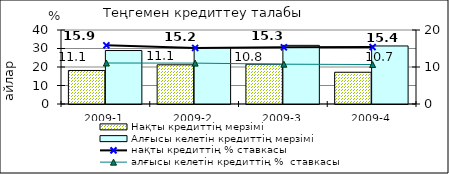
| Category | Нақты кредиттің мерзімі  | Алғысы келетін кредиттің мерзімі  |
|---|---|---|
| 2009-1 | 18.13 | 28.9 |
| 2009-2 | 21.19 | 30.36 |
| 2009-3 | 21.5 | 31.7 |
| 2009-4 | 17.17 | 31.37 |